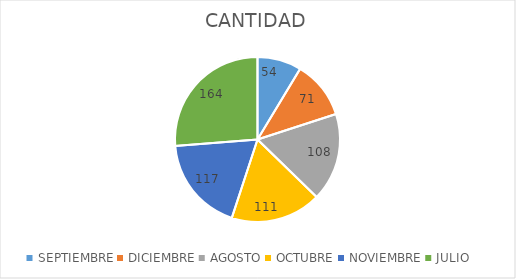
| Category | CANTIDAD |
|---|---|
| SEPTIEMBRE | 54 |
| DICIEMBRE | 71 |
| AGOSTO | 108 |
| OCTUBRE | 111 |
| NOVIEMBRE | 117 |
| JULIO | 164 |